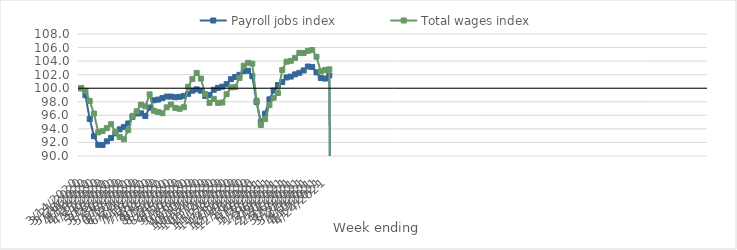
| Category | Payroll jobs index | Total wages index |
|---|---|---|
| 14/03/2020 | 100 | 100 |
| 21/03/2020 | 98.971 | 99.607 |
| 28/03/2020 | 95.468 | 98.119 |
| 04/04/2020 | 92.921 | 96.261 |
| 11/04/2020 | 91.648 | 93.491 |
| 18/04/2020 | 91.631 | 93.695 |
| 25/04/2020 | 92.161 | 94.112 |
| 02/05/2020 | 92.658 | 94.685 |
| 09/05/2020 | 93.342 | 93.574 |
| 16/05/2020 | 93.935 | 92.809 |
| 23/05/2020 | 94.29 | 92.465 |
| 30/05/2020 | 94.796 | 93.818 |
| 06/06/2020 | 95.779 | 95.924 |
| 13/06/2020 | 96.278 | 96.597 |
| 20/06/2020 | 96.293 | 97.571 |
| 27/06/2020 | 95.898 | 97.324 |
| 04/07/2020 | 97.132 | 99.089 |
| 11/07/2020 | 98.221 | 96.668 |
| 18/07/2020 | 98.324 | 96.5 |
| 25/07/2020 | 98.548 | 96.312 |
| 01/08/2020 | 98.77 | 97.181 |
| 08/08/2020 | 98.766 | 97.601 |
| 15/08/2020 | 98.672 | 97.108 |
| 22/08/2020 | 98.73 | 96.964 |
| 29/08/2020 | 98.866 | 97.198 |
| 05/09/2020 | 99.166 | 100.215 |
| 12/09/2020 | 99.638 | 101.349 |
| 19/09/2020 | 99.835 | 102.253 |
| 26/09/2020 | 99.64 | 101.42 |
| 03/10/2020 | 98.855 | 99.138 |
| 10/10/2020 | 98.997 | 97.834 |
| 17/10/2020 | 99.767 | 98.431 |
| 24/10/2020 | 100.05 | 97.835 |
| 31/10/2020 | 100.228 | 97.89 |
| 07/11/2020 | 100.597 | 99.112 |
| 14/11/2020 | 101.334 | 100.12 |
| 21/11/2020 | 101.652 | 100.166 |
| 28/11/2020 | 101.968 | 101.522 |
| 05/12/2020 | 102.515 | 103.324 |
| 12/12/2020 | 102.583 | 103.755 |
| 19/12/2020 | 101.771 | 103.629 |
| 26/12/2020 | 97.972 | 98.159 |
| 02/01/2021 | 95.021 | 94.58 |
| 09/01/2021 | 96.246 | 95.443 |
| 16/01/2021 | 98.354 | 97.531 |
| 23/01/2021 | 99.666 | 98.597 |
| 30/01/2021 | 100.48 | 99.293 |
| 06/02/2021 | 100.907 | 102.696 |
| 13/02/2021 | 101.592 | 103.915 |
| 20/02/2021 | 101.718 | 104.04 |
| 27/02/2021 | 102.048 | 104.48 |
| 06/03/2021 | 102.273 | 105.217 |
| 13/03/2021 | 102.625 | 105.198 |
| 20/03/2021 | 103.203 | 105.516 |
| 27/03/2021 | 103.136 | 105.634 |
| 03/04/2021 | 102.34 | 104.641 |
| 10/04/2021 | 101.508 | 102.484 |
| 17/04/2021 | 101.424 | 102.692 |
| 24/04/2021 | 101.89 | 102.787 |